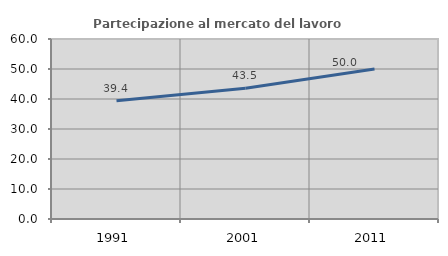
| Category | Partecipazione al mercato del lavoro  femminile |
|---|---|
| 1991.0 | 39.415 |
| 2001.0 | 43.548 |
| 2011.0 | 50 |